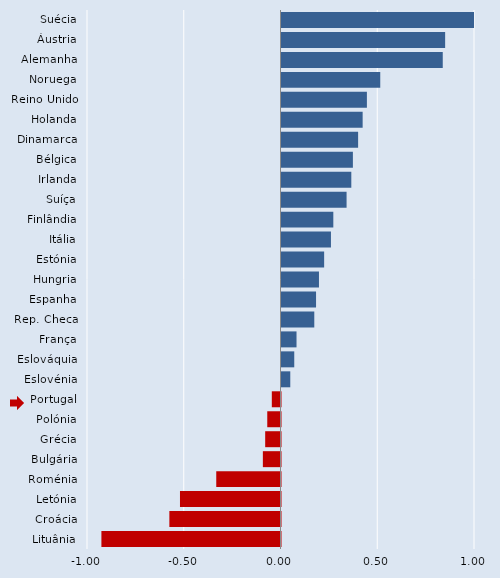
| Category | Series 0 |
|---|---|
| Suécia | 0.995 |
| Áustria | 0.846 |
| Alemanha | 0.833 |
| Noruega | 0.51 |
| Reino Unido | 0.441 |
| Holanda | 0.419 |
| Dinamarca | 0.396 |
| Bélgica | 0.369 |
| Irlanda | 0.361 |
| Suíça | 0.336 |
| Finlândia | 0.268 |
| Itália | 0.256 |
| Estónia | 0.22 |
| Hungria | 0.194 |
| Espanha | 0.179 |
| Rep. Checa | 0.169 |
| França | 0.078 |
| Eslováquia | 0.066 |
| Eslovénia | 0.045 |
| Portugal | -0.045 |
| Polónia | -0.068 |
| Grécia | -0.079 |
| Bulgária | -0.091 |
| Roménia | -0.332 |
| Letónia | -0.519 |
| Croácia | -0.574 |
| Lituânia | -0.926 |